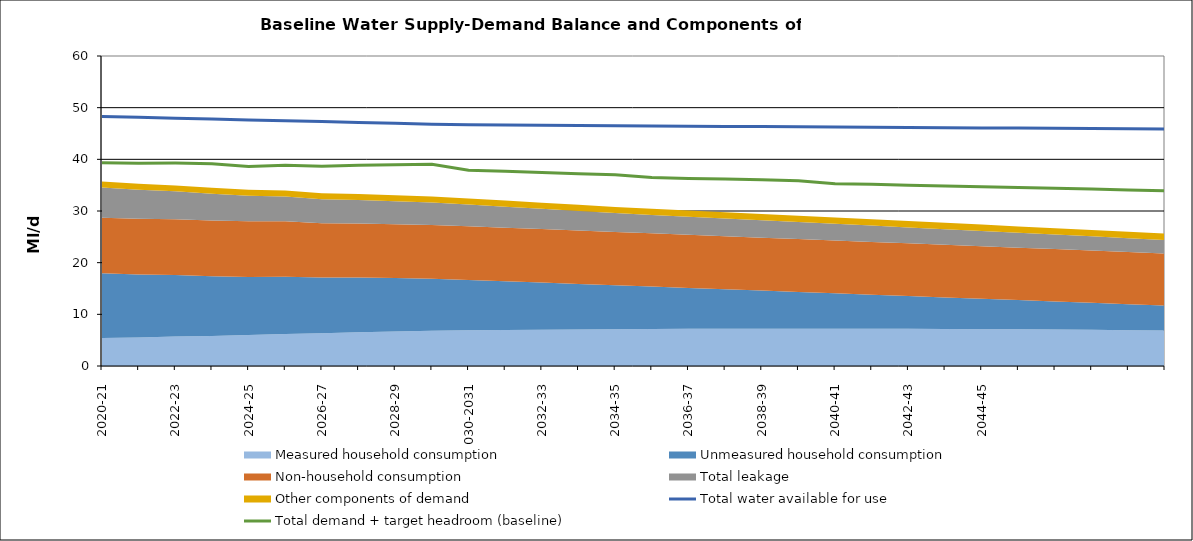
| Category | Total water available for use | Total demand + target headroom (baseline) |
|---|---|---|
| 0 | 48.306 | 39.316 |
| 1 | 48.138 | 39.254 |
| 2 | 47.971 | 39.285 |
| 3 | 47.803 | 39.168 |
| 4 | 47.635 | 38.615 |
| 5 | 47.467 | 38.85 |
| 6 | 47.3 | 38.642 |
| 7 | 47.132 | 38.855 |
| 8 | 46.964 | 38.949 |
| 9 | 46.796 | 39.04 |
| 10 | 46.671 | 37.897 |
| 11 | 46.629 | 37.679 |
| 12 | 46.587 | 37.447 |
| 13 | 46.545 | 37.197 |
| 14 | 46.503 | 36.998 |
| 15 | 46.461 | 36.477 |
| 16 | 46.419 | 36.311 |
| 17 | 46.377 | 36.18 |
| 18 | 46.335 | 36.026 |
| 19 | 46.293 | 35.87 |
| 20 | 46.251 | 35.288 |
| 21 | 46.209 | 35.174 |
| 22 | 46.167 | 34.986 |
| 23 | 46.126 | 34.849 |
| 24 | 46.084 | 34.707 |
| 25 | 46.042 | 34.543 |
| 26 | 46 | 34.411 |
| 27 | 45.958 | 34.24 |
| 28 | 45.916 | 34.083 |
| 29 | 45.874 | 33.9 |